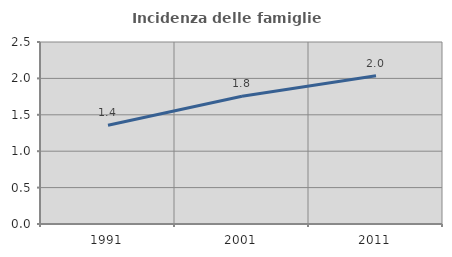
| Category | Incidenza delle famiglie numerose |
|---|---|
| 1991.0 | 1.357 |
| 2001.0 | 1.754 |
| 2011.0 | 2.035 |